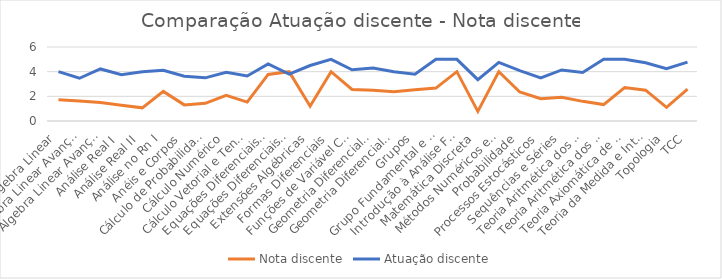
| Category | Nota discente | Atuação discente |
|---|---|---|
| Álgebra Linear | 1.72 | 3.999 |
| Álgebra Linear Avançada I | 1.618 | 3.464 |
| Álgebra Linear Avançada II | 1.5 | 4.22 |
| Análise Real I | 1.271 | 3.75 |
| Análise Real II | 1.067 | 4 |
| Análise no Rn I | 2.4 | 4.111 |
| Anéis e Corpos | 1.308 | 3.636 |
| Cálculo de Probabilidade | 1.435 | 3.5 |
| Cálculo Numérico | 2.087 | 3.957 |
| Cálculo Vetorial e Tensorial | 1.536 | 3.654 |
| Equações Diferenciais Ordinárias | 3.778 | 4.625 |
| Equações Diferenciais Parciais | 4 | 3.8 |
| Extensões Algébricas | 1.2 | 4.5 |
| Formas Diferenciais | 4 | 5 |
| Funções de Variável Complexa | 2.562 | 4.154 |
| Geometria Diferencial I | 2.5 | 4.3 |
| Geometria Diferencial II | 2.375 | 4 |
| Grupos | 2.529 | 3.8 |
| Grupo Fundamental e Espaço de Recobrimento | 2.667 | 5 |
| Introdução à Análise Funcional | 4 | 5 |
| Matemática Discreta | 0.78 | 3.352 |
| Métodos Numéricos em EDO's | 4 | 4.75 |
| Probabilidade | 2.353 | 4.083 |
| Processos Estocásticos | 1.8 | 3.5 |
| Sequências e Séries | 1.933 | 4.14 |
| Teoria Aritmética dos Números | 1.593 | 3.93 |
| Teoria Aritmética dos Números II | 1.333 | 5 |
| Teoria Axiomática de Conjuntos | 2.714 | 5 |
| Teoria da Medida e Integração | 2.5 | 4.727 |
| Topologia | 1.111 | 4.25 |
| TCC | 2.587 | 4.769 |